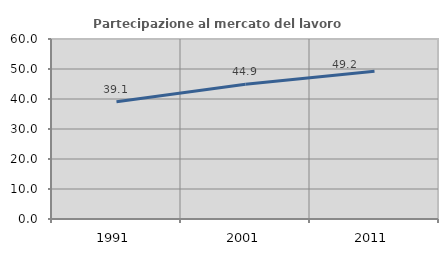
| Category | Partecipazione al mercato del lavoro  femminile |
|---|---|
| 1991.0 | 39.081 |
| 2001.0 | 44.89 |
| 2011.0 | 49.214 |